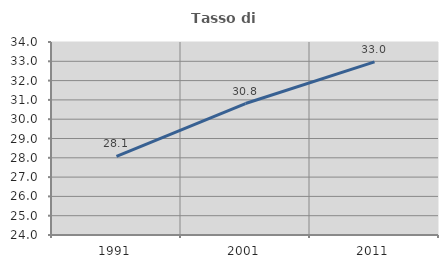
| Category | Tasso di occupazione   |
|---|---|
| 1991.0 | 28.076 |
| 2001.0 | 30.813 |
| 2011.0 | 32.971 |